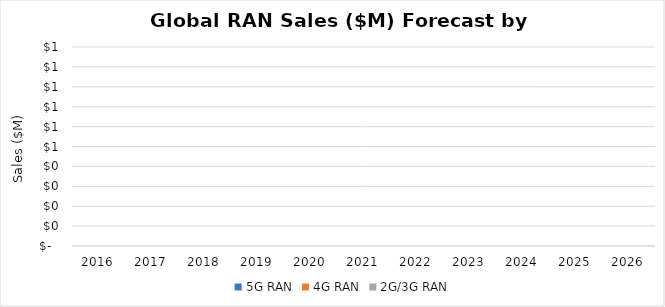
| Category | 5G RAN | 4G RAN | 2G/3G RAN |
|---|---|---|---|
| 2016.0 | 0 | 0 | 0 |
| 2017.0 | 0 | 0 | 0 |
| 2018.0 | 0 | 0 | 0 |
| 2019.0 | 0 | 0 | 0 |
| 2020.0 | 0 | 0 | 0 |
| 2021.0 | 0 | 0 | 0 |
| 2022.0 | 0 | 0 | 0 |
| 2023.0 | 0 | 0 | 0 |
| 2024.0 | 0 | 0 | 0 |
| 2025.0 | 0 | 0 | 0 |
| 2026.0 | 0 | 0 | 0 |